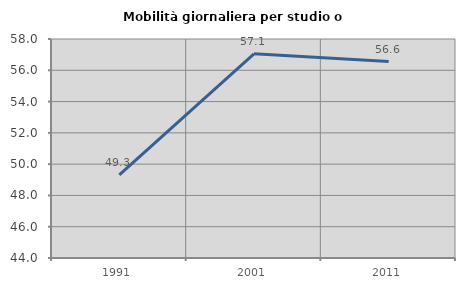
| Category | Mobilità giornaliera per studio o lavoro |
|---|---|
| 1991.0 | 49.32 |
| 2001.0 | 57.056 |
| 2011.0 | 56.557 |